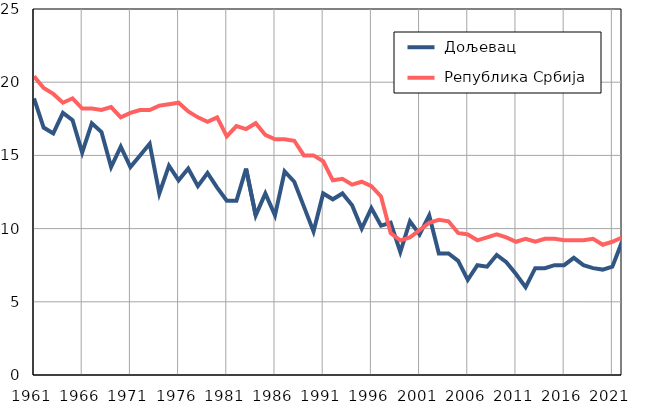
| Category |  Дољевац |  Република Србија |
|---|---|---|
| 1961.0 | 18.9 | 20.4 |
| 1962.0 | 16.9 | 19.6 |
| 1963.0 | 16.5 | 19.2 |
| 1964.0 | 17.9 | 18.6 |
| 1965.0 | 17.4 | 18.9 |
| 1966.0 | 15.2 | 18.2 |
| 1967.0 | 17.2 | 18.2 |
| 1968.0 | 16.6 | 18.1 |
| 1969.0 | 14.2 | 18.3 |
| 1970.0 | 15.6 | 17.6 |
| 1971.0 | 14.2 | 17.9 |
| 1972.0 | 15 | 18.1 |
| 1973.0 | 15.8 | 18.1 |
| 1974.0 | 12.4 | 18.4 |
| 1975.0 | 14.3 | 18.5 |
| 1976.0 | 13.3 | 18.6 |
| 1977.0 | 14.1 | 18 |
| 1978.0 | 12.9 | 17.6 |
| 1979.0 | 13.8 | 17.3 |
| 1980.0 | 12.8 | 17.6 |
| 1981.0 | 11.9 | 16.3 |
| 1982.0 | 11.9 | 17 |
| 1983.0 | 14.1 | 16.8 |
| 1984.0 | 10.9 | 17.2 |
| 1985.0 | 12.4 | 16.4 |
| 1986.0 | 10.9 | 16.1 |
| 1987.0 | 13.9 | 16.1 |
| 1988.0 | 13.2 | 16 |
| 1989.0 | 11.5 | 15 |
| 1990.0 | 9.8 | 15 |
| 1991.0 | 12.4 | 14.6 |
| 1992.0 | 12 | 13.3 |
| 1993.0 | 12.4 | 13.4 |
| 1994.0 | 11.6 | 13 |
| 1995.0 | 10 | 13.2 |
| 1996.0 | 11.4 | 12.9 |
| 1997.0 | 10.2 | 12.2 |
| 1998.0 | 10.4 | 9.7 |
| 1999.0 | 8.4 | 9.2 |
| 2000.0 | 10.5 | 9.4 |
| 2001.0 | 9.6 | 9.9 |
| 2002.0 | 10.9 | 10.4 |
| 2003.0 | 8.3 | 10.6 |
| 2004.0 | 8.3 | 10.5 |
| 2005.0 | 7.8 | 9.7 |
| 2006.0 | 6.5 | 9.6 |
| 2007.0 | 7.5 | 9.2 |
| 2008.0 | 7.4 | 9.4 |
| 2009.0 | 8.2 | 9.6 |
| 2010.0 | 7.7 | 9.4 |
| 2011.0 | 6.9 | 9.1 |
| 2012.0 | 6 | 9.3 |
| 2013.0 | 7.3 | 9.1 |
| 2014.0 | 7.3 | 9.3 |
| 2015.0 | 7.5 | 9.3 |
| 2016.0 | 7.5 | 9.2 |
| 2017.0 | 8 | 9.2 |
| 2018.0 | 7.5 | 9.2 |
| 2019.0 | 7.3 | 9.3 |
| 2020.0 | 7.2 | 8.9 |
| 2021.0 | 7.4 | 9.1 |
| 2022.0 | 9.1 | 9.4 |